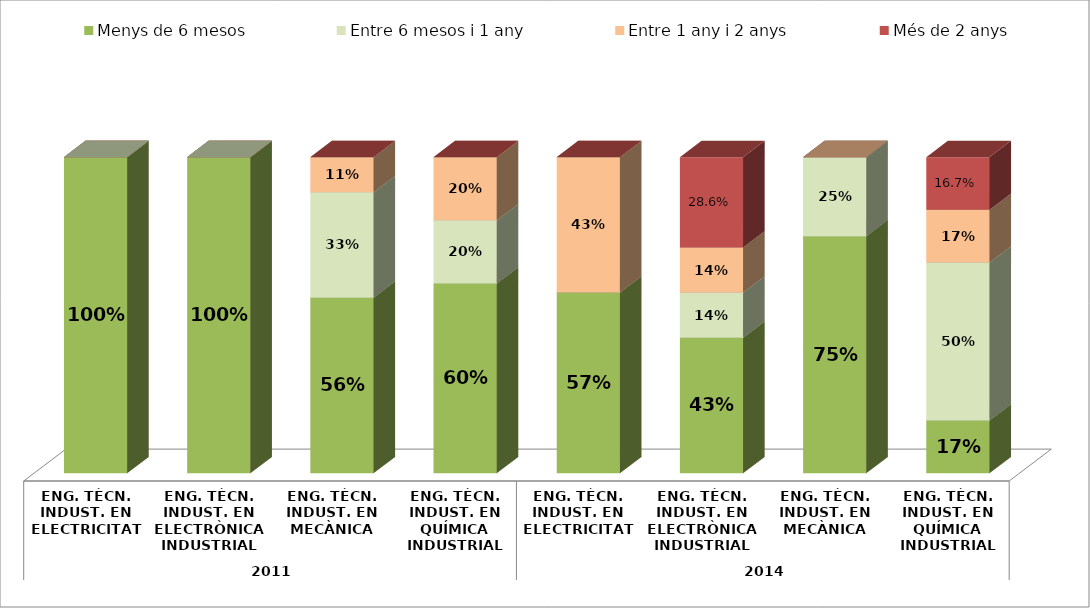
| Category | Menys de 6 mesos | Entre 6 mesos i 1 any | Entre 1 any i 2 anys | Més de 2 anys |
|---|---|---|---|---|
| 0 | 1 | 0 | 0 | 0 |
| 1 | 1 | 0 | 0 | 0 |
| 2 | 0.556 | 0.333 | 0.111 | 0 |
| 3 | 0.6 | 0.2 | 0.2 | 0 |
| 4 | 0.571 | 0 | 0.429 | 0 |
| 5 | 0.429 | 0.143 | 0.143 | 0.286 |
| 6 | 0.75 | 0.25 | 0 | 0 |
| 7 | 0.167 | 0.5 | 0.167 | 0.167 |